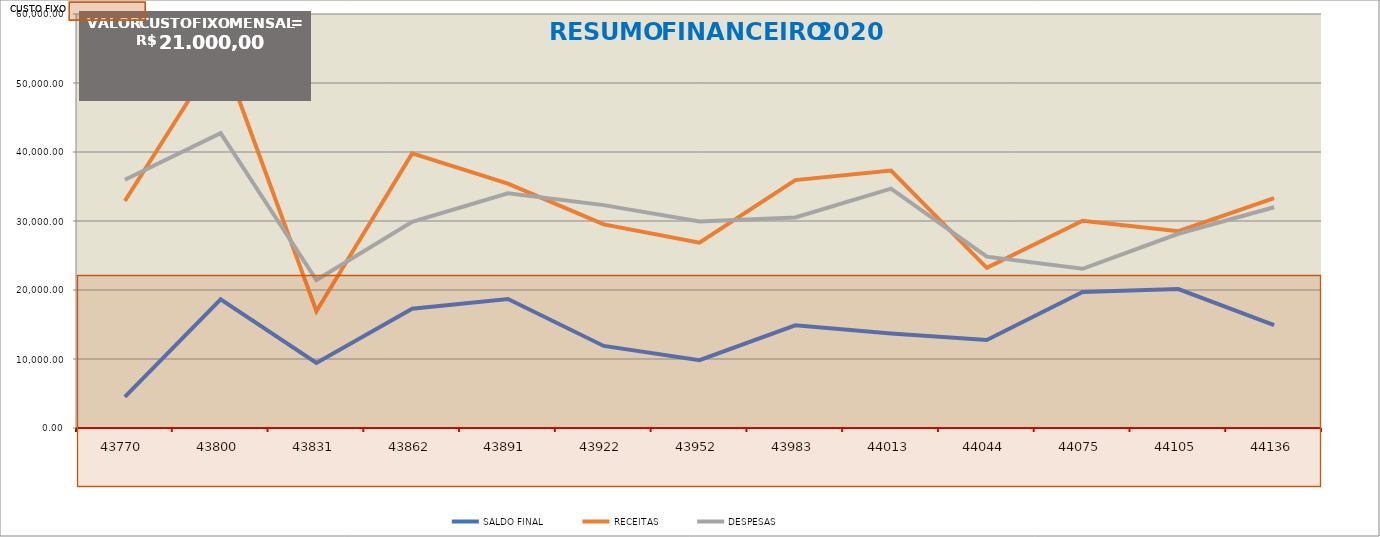
| Category | SALDO FINAL | RECEITAS | DESPESAS  |
|---|---|---|---|
| 2019-11-01 | 4506.97 | 32892.83 | 35979.09 |
| 2019-12-01 | 18643.56 | 54826.07 | 42739.48 |
| 2020-01-01 | 9428.91 | 16929.55 | 21447.62 |
| 2020-02-01 | 17281.1 | 39797.87 | 29885.68 |
| 2020-03-01 | 18686.55 | 35423.6 | 34018.15 |
| 2020-04-01 | 11892.77 | 29509.2 | 32302.98 |
| 2020-05-01 | 9839.7 | 26864.6 | 29917.67 |
| 2020-06-01 | 14882.45 | 35923.79 | 30508.56 |
| 2020-07-01 | 13707.28 | 37305.4 | 34688.29 |
| 2020-08-01 | 12750.87 | 23207.97 | 24828.5 |
| 2020-09-01 | 19706.82 | 30030.13 | 23074.18 |
| 2020-10-01 | 20135.89 | 28529.68 | 28148.03 |
| 2020-11-01 | 14925.58 | 33322.26 | 31988.72 |